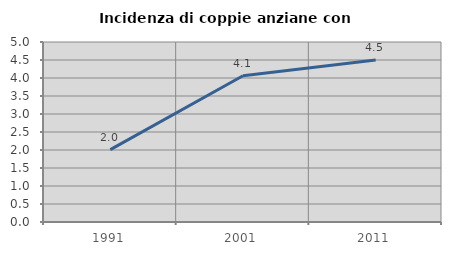
| Category | Incidenza di coppie anziane con figli |
|---|---|
| 1991.0 | 2.011 |
| 2001.0 | 4.062 |
| 2011.0 | 4.501 |